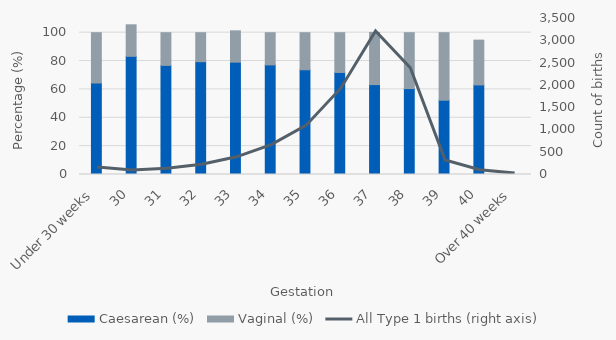
| Category | Caesarean (%) | Vaginal (%) |
|---|---|---|
| Under 30 weeks | 64.516 | 35.484 |
| 30 | 83.333 | 22.222 |
| 31 | 76.923 | 23.077 |
| 32 | 79.545 | 20.455 |
| 33 | 79.221 | 22.078 |
| 34 | 77.273 | 22.727 |
| 35 | 73.853 | 26.147 |
| 36 | 71.948 | 28.052 |
| 37 | 63.396 | 36.76 |
| 38 | 60.587 | 39.413 |
| 39 | 52.381 | 47.619 |
| 40 | 63.158 | 31.579 |
| Over 40 weeks | 0 | 0 |